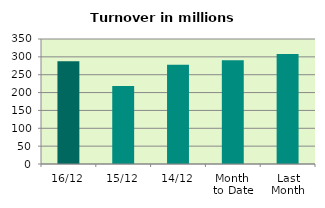
| Category | Series 0 |
|---|---|
| 16/12 | 287.723 |
| 15/12 | 218.431 |
| 14/12 | 278.216 |
| Month 
to Date | 290.566 |
| Last
Month | 307.664 |